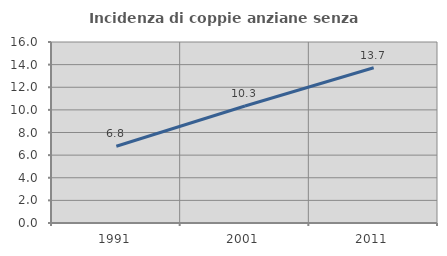
| Category | Incidenza di coppie anziane senza figli  |
|---|---|
| 1991.0 | 6.784 |
| 2001.0 | 10.345 |
| 2011.0 | 13.725 |